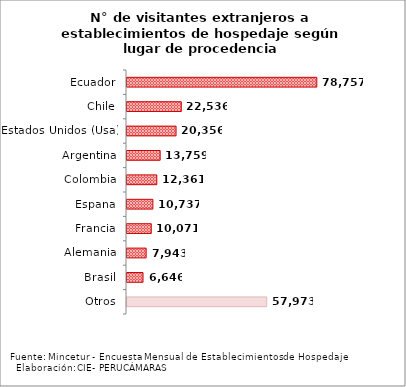
| Category | Series 0 |
|---|---|
| Ecuador | 78757 |
| Chile | 22536 |
| Estados Unidos (Usa) | 20356 |
| Argentina | 13759 |
| Colombia | 12361 |
| Espana | 10737 |
| Francia | 10071 |
| Alemania | 7943 |
| Brasil | 6646 |
| Otros | 57973 |